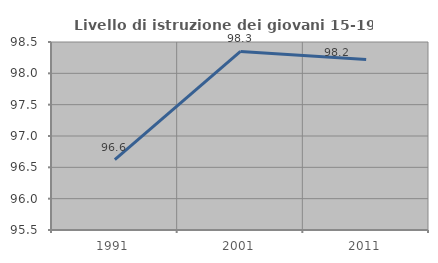
| Category | Livello di istruzione dei giovani 15-19 anni |
|---|---|
| 1991.0 | 96.624 |
| 2001.0 | 98.35 |
| 2011.0 | 98.221 |